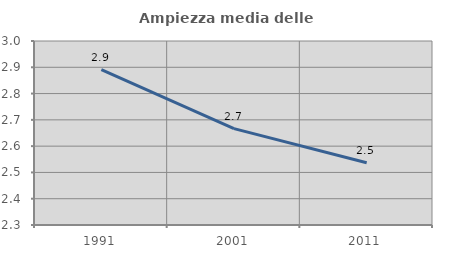
| Category | Ampiezza media delle famiglie |
|---|---|
| 1991.0 | 2.891 |
| 2001.0 | 2.667 |
| 2011.0 | 2.537 |